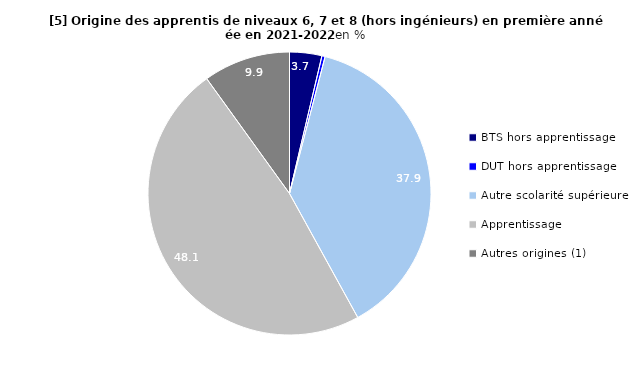
| Category | Series 0 | Series 1 |
|---|---|---|
| BTS hors apprentissage | 3.683 |  |
| DUT hors apprentissage | 0.368 |  |
| Autre scolarité supérieure | 37.937 |  |
| Apprentissage | 48.066 |  |
| Autres origines (1) | 9.945 |  |